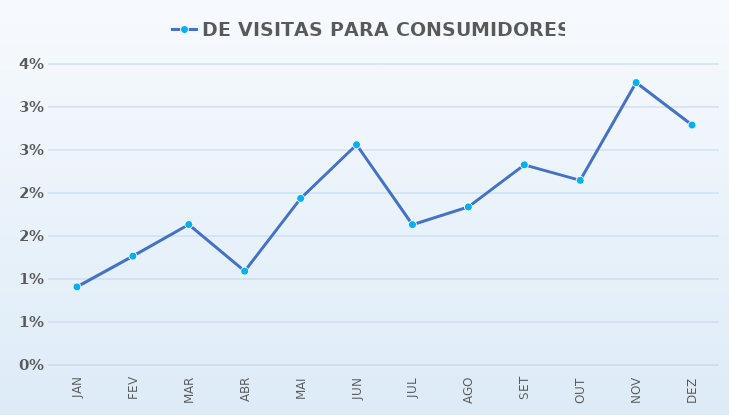
| Category | TAXA DE CONVERSÃO | DE VISITAS PARA CONSUMIDORES % |
|---|---|---|
| JAN |  | 0.009 |
| FEV |  | 0.013 |
| MAR |  | 0.016 |
| ABR |  | 0.011 |
| MAI |  | 0.019 |
| JUN |  | 0.026 |
| JUL |  | 0.016 |
| AGO |  | 0.018 |
| SET |  | 0.023 |
| OUT |  | 0.021 |
| NOV |  | 0.033 |
| DEZ |  | 0.028 |